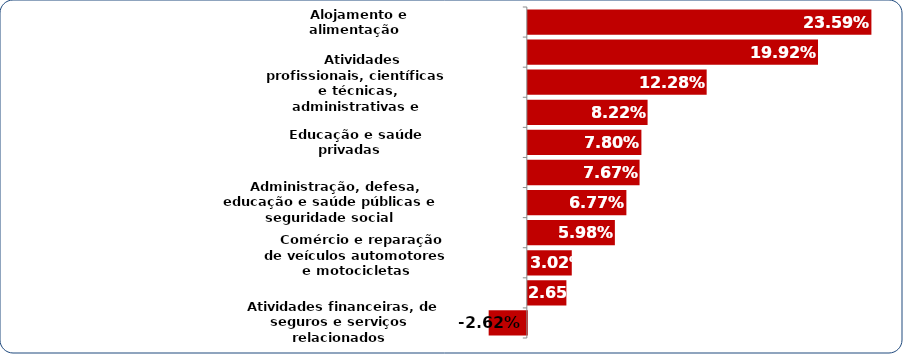
| Category | Series 0 |
|---|---|
|   Atividades financeiras, de seguros e serviços relacionados | -0.026 |
|   Atividades imobiliárias | 0.026 |
|   Comércio e reparação de veículos automotores e motocicletas | 0.03 |
|   Transporte, armazenagem e correio | 0.06 |
|   Administração, defesa, educação e saúde públicas e seguridade social | 0.068 |
|   Artes, cultura, esporte e recreação e outras atividades de serviços | 0.077 |
|   Educação e saúde privadas | 0.078 |
|   Informação e comunicação | 0.082 |
|   Atividades profissionais, científicas e técnicas, administrativas e serviços complementares | 0.123 |
|   Serviços domésticos | 0.199 |
|   Alojamento e alimentação | 0.236 |